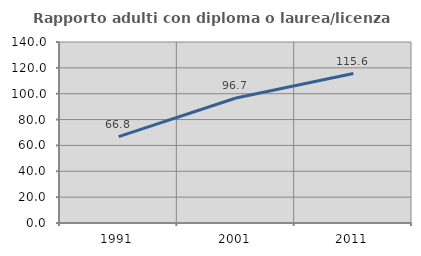
| Category | Rapporto adulti con diploma o laurea/licenza media  |
|---|---|
| 1991.0 | 66.757 |
| 2001.0 | 96.68 |
| 2011.0 | 115.564 |